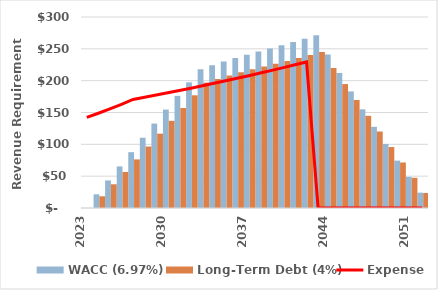
| Category | WACC (6.97%) | Long-Term Debt (4%) |
|---|---|---|
| 2023.0 | 0 | 0 |
| 2024.0 | 21.512 | 18.408 |
| 2025.0 | 43.288 | 37.248 |
| 2026.0 | 65.341 | 56.54 |
| 2027.0 | 87.688 | 76.307 |
| 2028.0 | 110.344 | 96.574 |
| 2029.0 | 132.643 | 116.781 |
| 2030.0 | 154.576 | 136.927 |
| 2031.0 | 176.138 | 157.01 |
| 2032.0 | 197.32 | 177.03 |
| 2033.0 | 218.115 | 196.984 |
| 2034.0 | 224.29 | 202.647 |
| 2035.0 | 230.134 | 208.003 |
| 2036.0 | 235.642 | 213.041 |
| 2037.0 | 240.807 | 217.745 |
| 2038.0 | 245.623 | 222.1 |
| 2039.0 | 250.536 | 226.542 |
| 2040.0 | 255.546 | 231.072 |
| 2041.0 | 260.657 | 235.694 |
| 2042.0 | 265.871 | 240.408 |
| 2043.0 | 271.188 | 245.216 |
| 2044.0 | 241.223 | 219.837 |
| 2045.0 | 211.858 | 194.639 |
| 2046.0 | 183.104 | 169.625 |
| 2047.0 | 154.974 | 144.799 |
| 2048.0 | 127.479 | 120.164 |
| 2049.0 | 100.633 | 95.725 |
| 2050.0 | 74.449 | 71.485 |
| 2051.0 | 48.94 | 47.448 |
| 2052.0 | 24.119 | 23.618 |